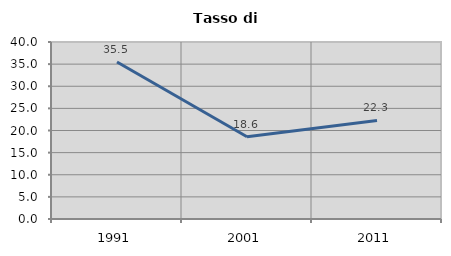
| Category | Tasso di disoccupazione   |
|---|---|
| 1991.0 | 35.466 |
| 2001.0 | 18.595 |
| 2011.0 | 22.285 |